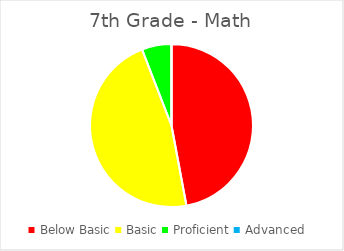
| Category | Series 0 |
|---|---|
| Below Basic | 0.471 |
| Basic | 0.471 |
| Proficient | 0.059 |
| Advanced | 0 |